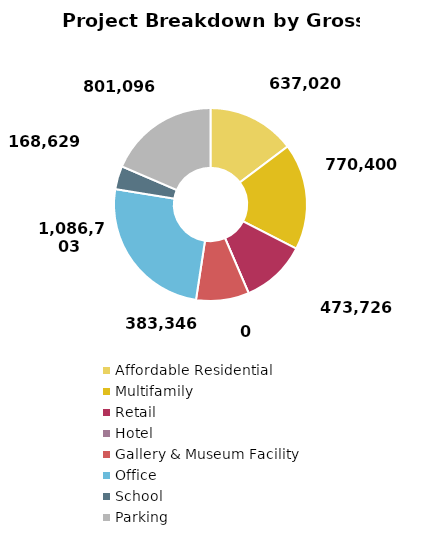
| Category | Series 0 |
|---|---|
| Affordable Residential | 637020.014 |
| Multifamily | 770400.011 |
| Retail | 473726.4 |
| Hotel | 0.006 |
| Gallery & Museum Facility | 383346 |
| Office | 1086703.2 |
| School | 168628.8 |
| Parking | 801096 |